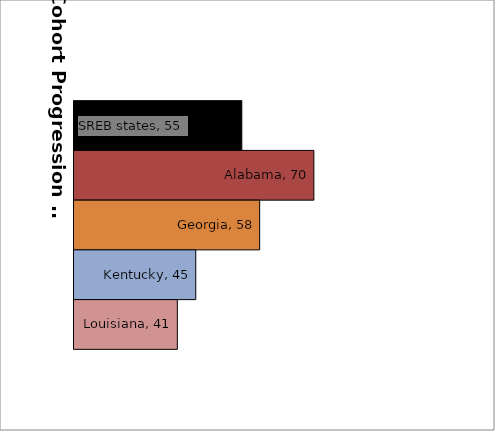
| Category | SREB states | Alabama | Georgia | Kentucky | Louisiana |
|---|---|---|---|---|---|
| 0 | 54.689 | 69.584 | 58.379 | 45.168 | 41.363 |